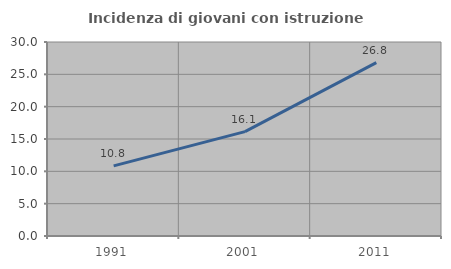
| Category | Incidenza di giovani con istruzione universitaria |
|---|---|
| 1991.0 | 10.85 |
| 2001.0 | 16.147 |
| 2011.0 | 26.821 |